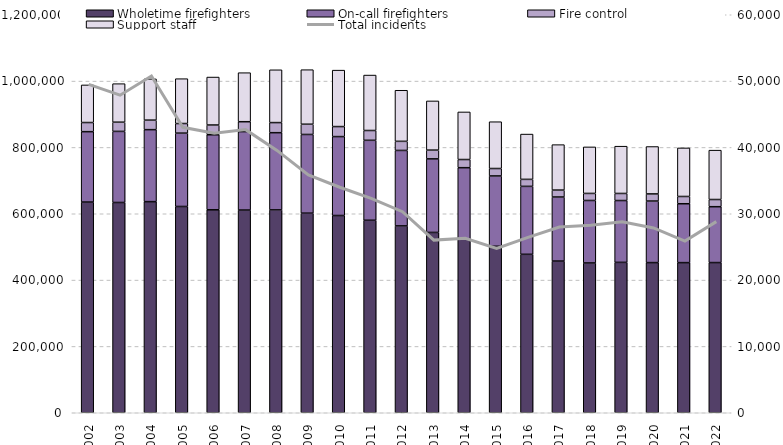
| Category | Wholetime firefighters | On-call firefighters | Fire control | Support staff |
|---|---|---|---|---|
| 2002 | 31761 | 10613 | 1379 | 5669 |
| 2003 | 31699 | 10716 | 1388 | 5807 |
| 2004 | 31826 | 10853 | 1435 | 6220 |
| 2005 | 31097 | 11056 | 1448 | 6762 |
| 2006 | 30596 | 11312 | 1470 | 7231 |
| 2007 | 30558 | 11827 | 1491 | 7390 |
| 2008 | 30580 | 11642 | 1522 | 7959 |
| 2009 | 30088 | 11865 | 1543 | 8224 |
| 2010 | 29735 | 11898 | 1510 | 8509 |
| 2011 | 29018 | 12055 | 1478 | 8358 |
| 2012 | 28166 | 11379 | 1371 | 7704 |
| 2013 | 27185 | 11088 | 1319 | 7419 |
| 2014 | 26178 | 10768 | 1228 | 7175 |
| 2015 | 25098 | 10602 | 1120 | 7056 |
| 2016 | 23887 | 10241 | 1055 | 6829 |
| 2017 | 22867 | 9657 | 1043 | 6852 |
| 2018 | 22580 | 9422 | 1061 | 7014 |
| 2019 | 22670 | 9325 | 1063 | 7128 |
| 2020 | 22638 | 9275 | 1078 | 7144 |
| 2021 | 22632 | 8876 | 1096 | 7321 |
| 2022 | 22642 | 8422 | 1084 | 7440 |